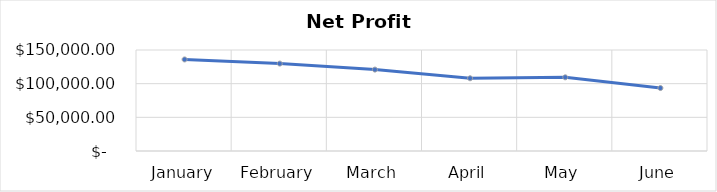
| Category | Net Profit (income) |
|---|---|
| January | 135970.658 |
| February | 129832.81 |
| March | 120896.729 |
| April | 108024.428 |
| May | 109442.137 |
| June | 93514.219 |